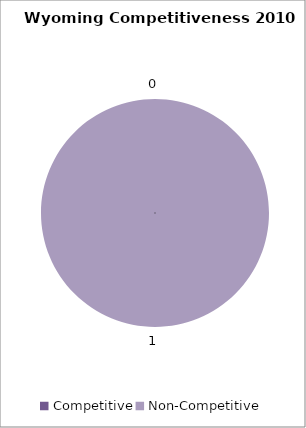
| Category | Alabama Competitiveness 2010 |
|---|---|
| 0 | 0 |
| 1 | 1 |